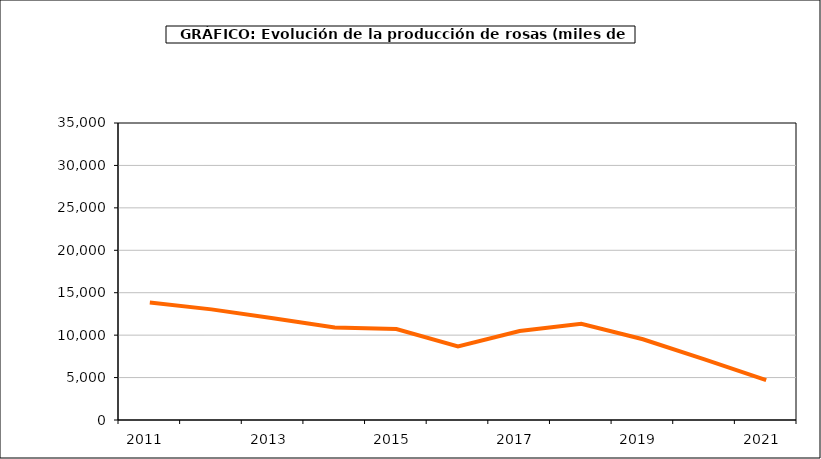
| Category | producción |
|---|---|
| 2011.0 | 13840 |
| 2012.0 | 13038 |
| 2013.0 | 11993 |
| 2014.0 | 10897 |
| 2015.0 | 10725 |
| 2016.0 | 8682 |
| 2017.0 | 10480 |
| 2018.0 | 11340 |
| 2019.0 | 9513 |
| 2020.0 | 7135 |
| 2021.0 | 4689 |